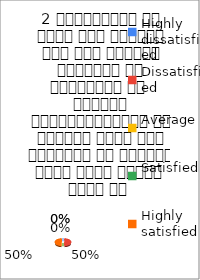
| Category | 2 व्याख्यान से रूचि में वृद्धि हुई एवं शिक्षण जानकारी से परिपूर्ण था 
शिक्षक विद्यार्थियों के द्वारा पूछे गये प्रश्नो का समाधान करने हेतु तत्पर  रहते है  |
|---|---|
| Highly dissatisfied | 0 |
| Dissatisfied | 1 |
| Average | 0 |
| Satisfied | 0 |
| Highly satisfied | 1 |